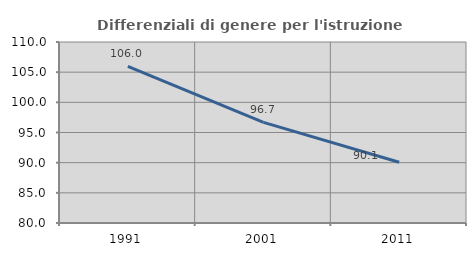
| Category | Differenziali di genere per l'istruzione superiore |
|---|---|
| 1991.0 | 105.977 |
| 2001.0 | 96.67 |
| 2011.0 | 90.074 |